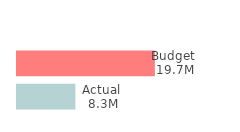
| Category | Actual  | Budget  |
|---|---|---|
| Total | 8340291 | 19695000 |